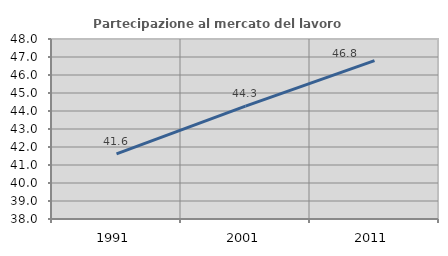
| Category | Partecipazione al mercato del lavoro  femminile |
|---|---|
| 1991.0 | 41.617 |
| 2001.0 | 44.272 |
| 2011.0 | 46.797 |